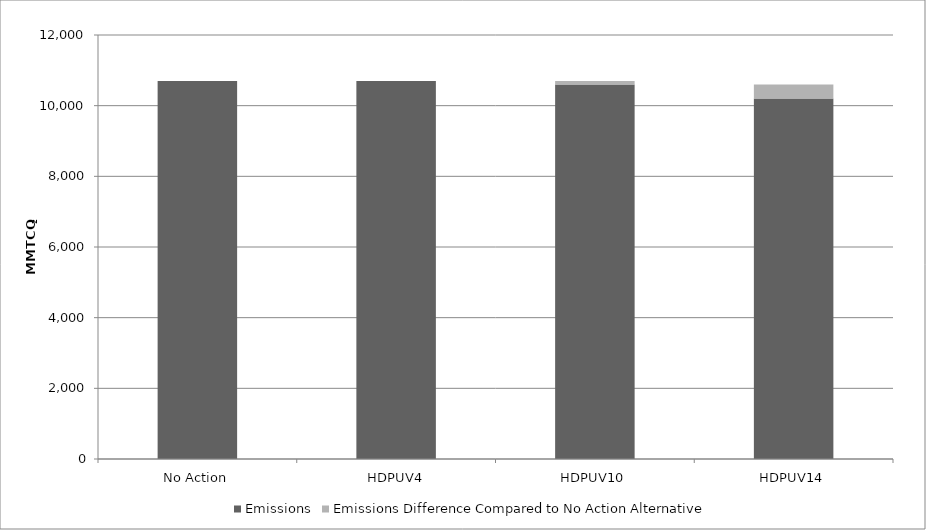
| Category | Emissions | Emissions Difference Compared to No Action Alternative |
|---|---|---|
| No Action | 10700 | 0 |
| HDPUV4 | 10700 | 0 |
| HDPUV10 | 10600 | 100 |
| HDPUV14 | 10200 | 400 |